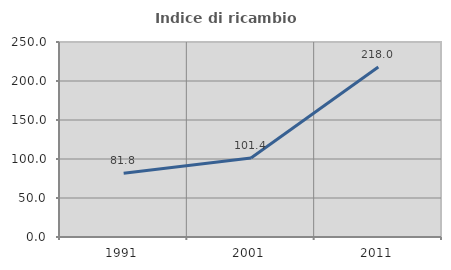
| Category | Indice di ricambio occupazionale  |
|---|---|
| 1991.0 | 81.771 |
| 2001.0 | 101.361 |
| 2011.0 | 217.978 |